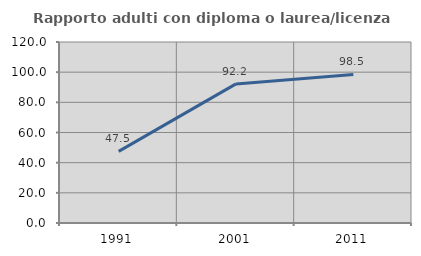
| Category | Rapporto adulti con diploma o laurea/licenza media  |
|---|---|
| 1991.0 | 47.464 |
| 2001.0 | 92.219 |
| 2011.0 | 98.496 |